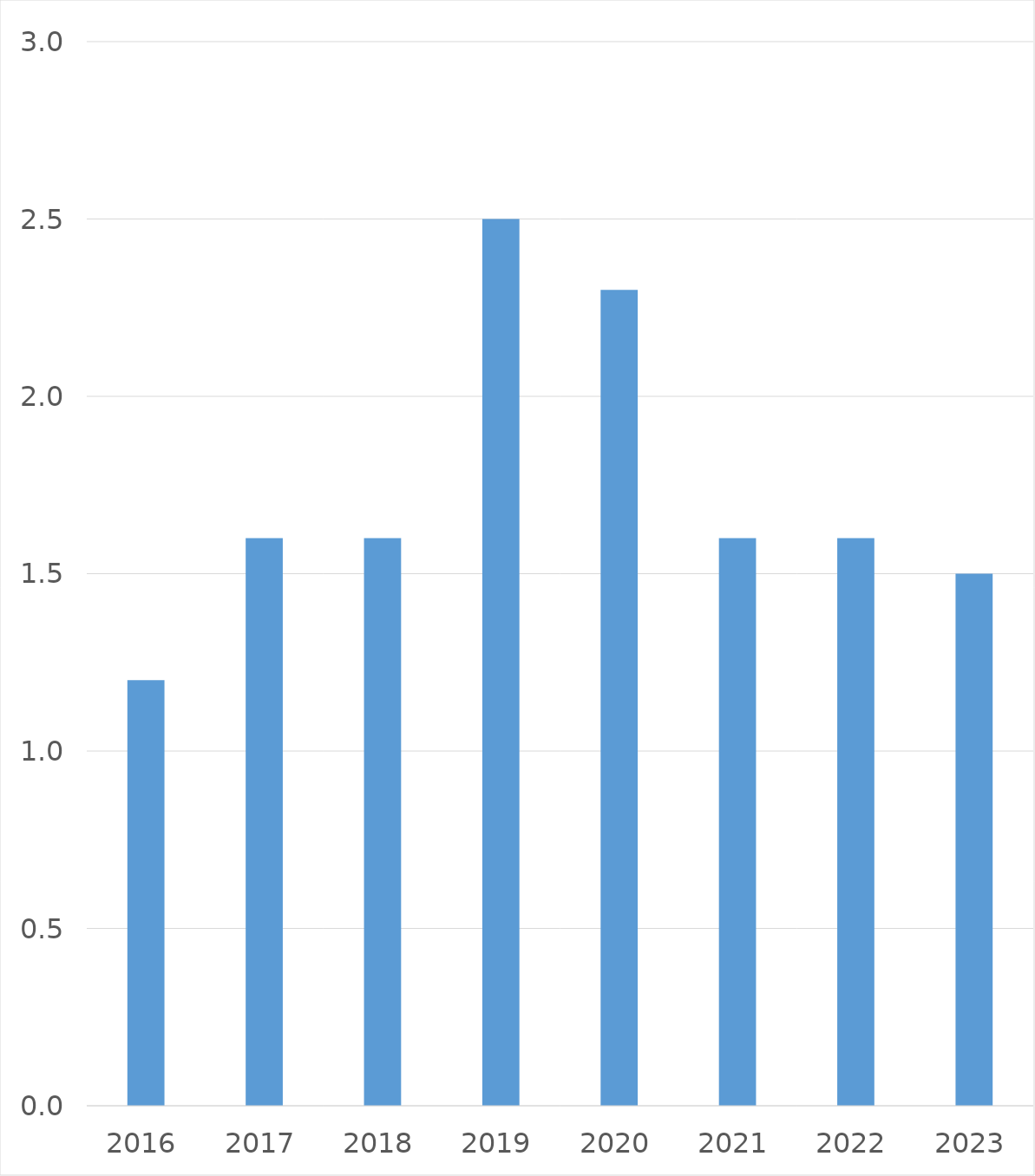
| Category | Series 0 |
|---|---|
| 2016 | 1.2 |
| 2017 | 1.6 |
| 2018 | 1.6 |
| 2019 | 2.5 |
| 2020 | 2.3 |
| 2021 | 1.6 |
| 2022 | 1.6 |
| 2023 | 1.5 |